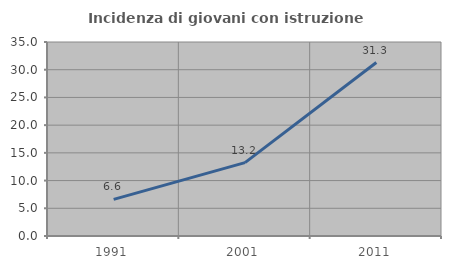
| Category | Incidenza di giovani con istruzione universitaria |
|---|---|
| 1991.0 | 6.612 |
| 2001.0 | 13.235 |
| 2011.0 | 31.296 |